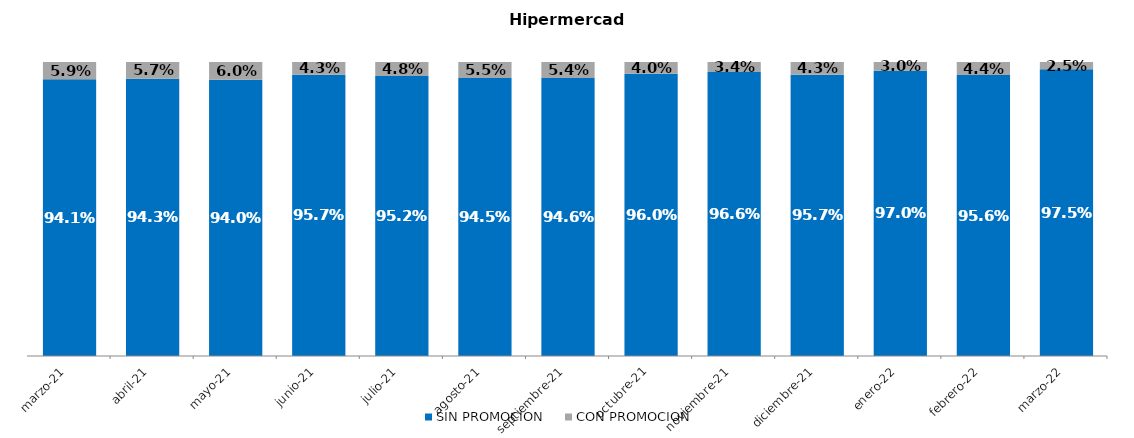
| Category | SIN PROMOCION   | CON PROMOCION   |
|---|---|---|
| 2021-03-01 | 0.941 | 0.059 |
| 2021-04-01 | 0.943 | 0.057 |
| 2021-05-01 | 0.94 | 0.06 |
| 2021-06-01 | 0.957 | 0.043 |
| 2021-07-01 | 0.952 | 0.048 |
| 2021-08-01 | 0.945 | 0.055 |
| 2021-09-01 | 0.946 | 0.054 |
| 2021-10-01 | 0.96 | 0.04 |
| 2021-11-01 | 0.966 | 0.034 |
| 2021-12-01 | 0.957 | 0.043 |
| 2022-01-01 | 0.97 | 0.03 |
| 2022-02-01 | 0.956 | 0.044 |
| 2022-03-01 | 0.975 | 0.025 |